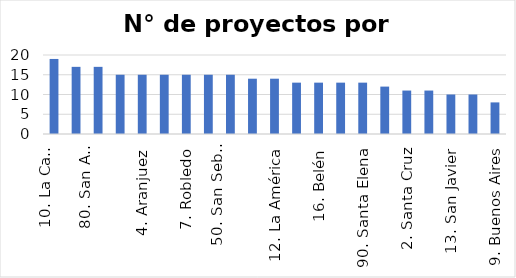
| Category | N° de proyectos |
|---|---|
| 10. La Candelaria | 19 |
| 1. Popular | 17 |
| 80. San Antonio de Prado | 17 |
| 3. Manrique | 15 |
| 4. Aranjuez | 15 |
| 5. Castilla | 15 |
| 7. Robledo | 15 |
| 8. Villa Hermosa | 15 |
| 50. San Sebastián de Palmitas | 15 |
| 11. Laureles-Estadio | 14 |
| 12. La América | 14 |
| 15. Guayabal | 13 |
| 16. Belén | 13 |
| 60. San Cristobal | 13 |
| 90. Santa Elena | 13 |
| 6. Doce de Octubre | 12 |
| 2. Santa Cruz | 11 |
| 14. El Poblado | 11 |
| 13. San Javier | 10 |
| 70. Altavista | 10 |
| 9. Buenos Aires | 8 |